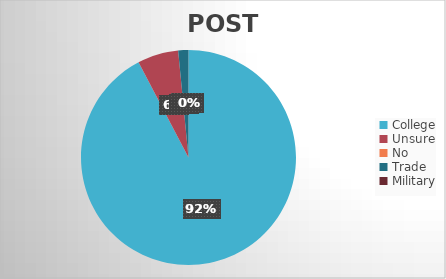
| Category | Series 0 |
|---|---|
| College | 60 |
| Unsure | 4 |
| No | 0 |
| Trade | 1 |
| Military | 0 |